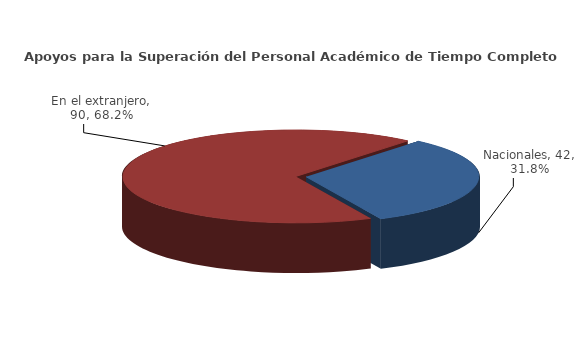
| Category | Series 0 |
|---|---|
| Nacionales | 42 |
| En el extranjero | 90 |